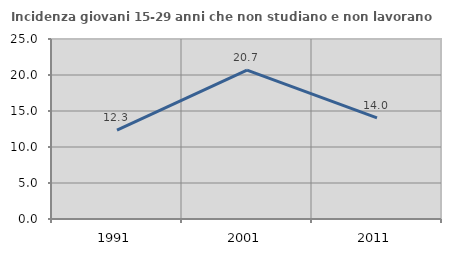
| Category | Incidenza giovani 15-29 anni che non studiano e non lavorano  |
|---|---|
| 1991.0 | 12.339 |
| 2001.0 | 20.69 |
| 2011.0 | 14.035 |